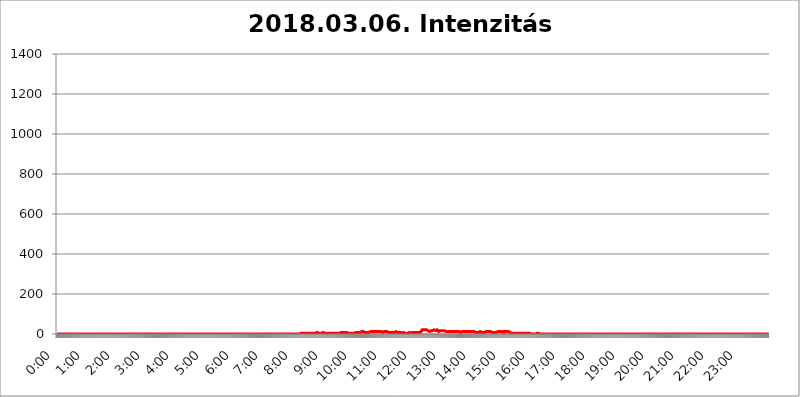
| Category | 2018.03.06. Intenzitás [W/m^2] |
|---|---|
| 0.0 | 0 |
| 0.0006944444444444445 | 0 |
| 0.001388888888888889 | 0 |
| 0.0020833333333333333 | 0 |
| 0.002777777777777778 | 0 |
| 0.003472222222222222 | 0 |
| 0.004166666666666667 | 0 |
| 0.004861111111111111 | 0 |
| 0.005555555555555556 | 0 |
| 0.0062499999999999995 | 0 |
| 0.006944444444444444 | 0 |
| 0.007638888888888889 | 0 |
| 0.008333333333333333 | 0 |
| 0.009027777777777779 | 0 |
| 0.009722222222222222 | 0 |
| 0.010416666666666666 | 0 |
| 0.011111111111111112 | 0 |
| 0.011805555555555555 | 0 |
| 0.012499999999999999 | 0 |
| 0.013194444444444444 | 0 |
| 0.013888888888888888 | 0 |
| 0.014583333333333332 | 0 |
| 0.015277777777777777 | 0 |
| 0.015972222222222224 | 0 |
| 0.016666666666666666 | 0 |
| 0.017361111111111112 | 0 |
| 0.018055555555555557 | 0 |
| 0.01875 | 0 |
| 0.019444444444444445 | 0 |
| 0.02013888888888889 | 0 |
| 0.020833333333333332 | 0 |
| 0.02152777777777778 | 0 |
| 0.022222222222222223 | 0 |
| 0.02291666666666667 | 0 |
| 0.02361111111111111 | 0 |
| 0.024305555555555556 | 0 |
| 0.024999999999999998 | 0 |
| 0.025694444444444447 | 0 |
| 0.02638888888888889 | 0 |
| 0.027083333333333334 | 0 |
| 0.027777777777777776 | 0 |
| 0.02847222222222222 | 0 |
| 0.029166666666666664 | 0 |
| 0.029861111111111113 | 0 |
| 0.030555555555555555 | 0 |
| 0.03125 | 0 |
| 0.03194444444444445 | 0 |
| 0.03263888888888889 | 0 |
| 0.03333333333333333 | 0 |
| 0.034027777777777775 | 0 |
| 0.034722222222222224 | 0 |
| 0.035416666666666666 | 0 |
| 0.036111111111111115 | 0 |
| 0.03680555555555556 | 0 |
| 0.0375 | 0 |
| 0.03819444444444444 | 0 |
| 0.03888888888888889 | 0 |
| 0.03958333333333333 | 0 |
| 0.04027777777777778 | 0 |
| 0.04097222222222222 | 0 |
| 0.041666666666666664 | 0 |
| 0.042361111111111106 | 0 |
| 0.04305555555555556 | 0 |
| 0.043750000000000004 | 0 |
| 0.044444444444444446 | 0 |
| 0.04513888888888889 | 0 |
| 0.04583333333333334 | 0 |
| 0.04652777777777778 | 0 |
| 0.04722222222222222 | 0 |
| 0.04791666666666666 | 0 |
| 0.04861111111111111 | 0 |
| 0.049305555555555554 | 0 |
| 0.049999999999999996 | 0 |
| 0.05069444444444445 | 0 |
| 0.051388888888888894 | 0 |
| 0.052083333333333336 | 0 |
| 0.05277777777777778 | 0 |
| 0.05347222222222222 | 0 |
| 0.05416666666666667 | 0 |
| 0.05486111111111111 | 0 |
| 0.05555555555555555 | 0 |
| 0.05625 | 0 |
| 0.05694444444444444 | 0 |
| 0.057638888888888885 | 0 |
| 0.05833333333333333 | 0 |
| 0.05902777777777778 | 0 |
| 0.059722222222222225 | 0 |
| 0.06041666666666667 | 0 |
| 0.061111111111111116 | 0 |
| 0.06180555555555556 | 0 |
| 0.0625 | 0 |
| 0.06319444444444444 | 0 |
| 0.06388888888888888 | 0 |
| 0.06458333333333334 | 0 |
| 0.06527777777777778 | 0 |
| 0.06597222222222222 | 0 |
| 0.06666666666666667 | 0 |
| 0.06736111111111111 | 0 |
| 0.06805555555555555 | 0 |
| 0.06874999999999999 | 0 |
| 0.06944444444444443 | 0 |
| 0.07013888888888889 | 0 |
| 0.07083333333333333 | 0 |
| 0.07152777777777779 | 0 |
| 0.07222222222222223 | 0 |
| 0.07291666666666667 | 0 |
| 0.07361111111111111 | 0 |
| 0.07430555555555556 | 0 |
| 0.075 | 0 |
| 0.07569444444444444 | 0 |
| 0.0763888888888889 | 0 |
| 0.07708333333333334 | 0 |
| 0.07777777777777778 | 0 |
| 0.07847222222222222 | 0 |
| 0.07916666666666666 | 0 |
| 0.0798611111111111 | 0 |
| 0.08055555555555556 | 0 |
| 0.08125 | 0 |
| 0.08194444444444444 | 0 |
| 0.08263888888888889 | 0 |
| 0.08333333333333333 | 0 |
| 0.08402777777777777 | 0 |
| 0.08472222222222221 | 0 |
| 0.08541666666666665 | 0 |
| 0.08611111111111112 | 0 |
| 0.08680555555555557 | 0 |
| 0.08750000000000001 | 0 |
| 0.08819444444444445 | 0 |
| 0.08888888888888889 | 0 |
| 0.08958333333333333 | 0 |
| 0.09027777777777778 | 0 |
| 0.09097222222222222 | 0 |
| 0.09166666666666667 | 0 |
| 0.09236111111111112 | 0 |
| 0.09305555555555556 | 0 |
| 0.09375 | 0 |
| 0.09444444444444444 | 0 |
| 0.09513888888888888 | 0 |
| 0.09583333333333333 | 0 |
| 0.09652777777777777 | 0 |
| 0.09722222222222222 | 0 |
| 0.09791666666666667 | 0 |
| 0.09861111111111111 | 0 |
| 0.09930555555555555 | 0 |
| 0.09999999999999999 | 0 |
| 0.10069444444444443 | 0 |
| 0.1013888888888889 | 0 |
| 0.10208333333333335 | 0 |
| 0.10277777777777779 | 0 |
| 0.10347222222222223 | 0 |
| 0.10416666666666667 | 0 |
| 0.10486111111111111 | 0 |
| 0.10555555555555556 | 0 |
| 0.10625 | 0 |
| 0.10694444444444444 | 0 |
| 0.1076388888888889 | 0 |
| 0.10833333333333334 | 0 |
| 0.10902777777777778 | 0 |
| 0.10972222222222222 | 0 |
| 0.1111111111111111 | 0 |
| 0.11180555555555556 | 0 |
| 0.11180555555555556 | 0 |
| 0.1125 | 0 |
| 0.11319444444444444 | 0 |
| 0.11388888888888889 | 0 |
| 0.11458333333333333 | 0 |
| 0.11527777777777777 | 0 |
| 0.11597222222222221 | 0 |
| 0.11666666666666665 | 0 |
| 0.1173611111111111 | 0 |
| 0.11805555555555557 | 0 |
| 0.11944444444444445 | 0 |
| 0.12013888888888889 | 0 |
| 0.12083333333333333 | 0 |
| 0.12152777777777778 | 0 |
| 0.12222222222222223 | 0 |
| 0.12291666666666667 | 0 |
| 0.12291666666666667 | 0 |
| 0.12361111111111112 | 0 |
| 0.12430555555555556 | 0 |
| 0.125 | 0 |
| 0.12569444444444444 | 0 |
| 0.12638888888888888 | 0 |
| 0.12708333333333333 | 0 |
| 0.16875 | 0 |
| 0.12847222222222224 | 0 |
| 0.12916666666666668 | 0 |
| 0.12986111111111112 | 0 |
| 0.13055555555555556 | 0 |
| 0.13125 | 0 |
| 0.13194444444444445 | 0 |
| 0.1326388888888889 | 0 |
| 0.13333333333333333 | 0 |
| 0.13402777777777777 | 0 |
| 0.13402777777777777 | 0 |
| 0.13472222222222222 | 0 |
| 0.13541666666666666 | 0 |
| 0.1361111111111111 | 0 |
| 0.13749999999999998 | 0 |
| 0.13819444444444443 | 0 |
| 0.1388888888888889 | 0 |
| 0.13958333333333334 | 0 |
| 0.14027777777777778 | 0 |
| 0.14097222222222222 | 0 |
| 0.14166666666666666 | 0 |
| 0.1423611111111111 | 0 |
| 0.14305555555555557 | 0 |
| 0.14375000000000002 | 0 |
| 0.14444444444444446 | 0 |
| 0.1451388888888889 | 0 |
| 0.1451388888888889 | 0 |
| 0.14652777777777778 | 0 |
| 0.14722222222222223 | 0 |
| 0.14791666666666667 | 0 |
| 0.1486111111111111 | 0 |
| 0.14930555555555555 | 0 |
| 0.15 | 0 |
| 0.15069444444444444 | 0 |
| 0.15138888888888888 | 0 |
| 0.15208333333333332 | 0 |
| 0.15277777777777776 | 0 |
| 0.15347222222222223 | 0 |
| 0.15416666666666667 | 0 |
| 0.15486111111111112 | 0 |
| 0.15555555555555556 | 0 |
| 0.15625 | 0 |
| 0.15694444444444444 | 0 |
| 0.15763888888888888 | 0 |
| 0.15833333333333333 | 0 |
| 0.15902777777777777 | 0 |
| 0.15972222222222224 | 0 |
| 0.16041666666666668 | 0 |
| 0.16111111111111112 | 0 |
| 0.16180555555555556 | 0 |
| 0.1625 | 0 |
| 0.16319444444444445 | 0 |
| 0.1638888888888889 | 0 |
| 0.16458333333333333 | 0 |
| 0.16527777777777777 | 0 |
| 0.16597222222222222 | 0 |
| 0.16666666666666666 | 0 |
| 0.1673611111111111 | 0 |
| 0.16805555555555554 | 0 |
| 0.16874999999999998 | 0 |
| 0.16944444444444443 | 0 |
| 0.17013888888888887 | 0 |
| 0.1708333333333333 | 0 |
| 0.17152777777777775 | 0 |
| 0.17222222222222225 | 0 |
| 0.1729166666666667 | 0 |
| 0.17361111111111113 | 0 |
| 0.17430555555555557 | 0 |
| 0.17500000000000002 | 0 |
| 0.17569444444444446 | 0 |
| 0.1763888888888889 | 0 |
| 0.17708333333333334 | 0 |
| 0.17777777777777778 | 0 |
| 0.17847222222222223 | 0 |
| 0.17916666666666667 | 0 |
| 0.1798611111111111 | 0 |
| 0.18055555555555555 | 0 |
| 0.18125 | 0 |
| 0.18194444444444444 | 0 |
| 0.1826388888888889 | 0 |
| 0.18333333333333335 | 0 |
| 0.1840277777777778 | 0 |
| 0.18472222222222223 | 0 |
| 0.18541666666666667 | 0 |
| 0.18611111111111112 | 0 |
| 0.18680555555555556 | 0 |
| 0.1875 | 0 |
| 0.18819444444444444 | 0 |
| 0.18888888888888888 | 0 |
| 0.18958333333333333 | 0 |
| 0.19027777777777777 | 0 |
| 0.1909722222222222 | 0 |
| 0.19166666666666665 | 0 |
| 0.19236111111111112 | 0 |
| 0.19305555555555554 | 0 |
| 0.19375 | 0 |
| 0.19444444444444445 | 0 |
| 0.1951388888888889 | 0 |
| 0.19583333333333333 | 0 |
| 0.19652777777777777 | 0 |
| 0.19722222222222222 | 0 |
| 0.19791666666666666 | 0 |
| 0.1986111111111111 | 0 |
| 0.19930555555555554 | 0 |
| 0.19999999999999998 | 0 |
| 0.20069444444444443 | 0 |
| 0.20138888888888887 | 0 |
| 0.2020833333333333 | 0 |
| 0.2027777777777778 | 0 |
| 0.2034722222222222 | 0 |
| 0.2041666666666667 | 0 |
| 0.20486111111111113 | 0 |
| 0.20555555555555557 | 0 |
| 0.20625000000000002 | 0 |
| 0.20694444444444446 | 0 |
| 0.2076388888888889 | 0 |
| 0.20833333333333334 | 0 |
| 0.20902777777777778 | 0 |
| 0.20972222222222223 | 0 |
| 0.21041666666666667 | 0 |
| 0.2111111111111111 | 0 |
| 0.21180555555555555 | 0 |
| 0.2125 | 0 |
| 0.21319444444444444 | 0 |
| 0.2138888888888889 | 0 |
| 0.21458333333333335 | 0 |
| 0.2152777777777778 | 0 |
| 0.21597222222222223 | 0 |
| 0.21666666666666667 | 0 |
| 0.21736111111111112 | 0 |
| 0.21805555555555556 | 0 |
| 0.21875 | 0 |
| 0.21944444444444444 | 0 |
| 0.22013888888888888 | 0 |
| 0.22083333333333333 | 0 |
| 0.22152777777777777 | 0 |
| 0.2222222222222222 | 0 |
| 0.22291666666666665 | 0 |
| 0.2236111111111111 | 0 |
| 0.22430555555555556 | 0 |
| 0.225 | 0 |
| 0.22569444444444445 | 0 |
| 0.2263888888888889 | 0 |
| 0.22708333333333333 | 0 |
| 0.22777777777777777 | 0 |
| 0.22847222222222222 | 0 |
| 0.22916666666666666 | 0 |
| 0.2298611111111111 | 0 |
| 0.23055555555555554 | 0 |
| 0.23124999999999998 | 0 |
| 0.23194444444444443 | 0 |
| 0.23263888888888887 | 0 |
| 0.2333333333333333 | 0 |
| 0.2340277777777778 | 0 |
| 0.2347222222222222 | 0 |
| 0.2354166666666667 | 0 |
| 0.23611111111111113 | 0 |
| 0.23680555555555557 | 0 |
| 0.23750000000000002 | 0 |
| 0.23819444444444446 | 0 |
| 0.2388888888888889 | 0 |
| 0.23958333333333334 | 0 |
| 0.24027777777777778 | 0 |
| 0.24097222222222223 | 0 |
| 0.24166666666666667 | 0 |
| 0.2423611111111111 | 0 |
| 0.24305555555555555 | 0 |
| 0.24375 | 0 |
| 0.24444444444444446 | 0 |
| 0.24513888888888888 | 0 |
| 0.24583333333333335 | 0 |
| 0.2465277777777778 | 0 |
| 0.24722222222222223 | 0 |
| 0.24791666666666667 | 0 |
| 0.24861111111111112 | 0 |
| 0.24930555555555556 | 0 |
| 0.25 | 0 |
| 0.25069444444444444 | 0 |
| 0.2513888888888889 | 0 |
| 0.2520833333333333 | 0 |
| 0.25277777777777777 | 0 |
| 0.2534722222222222 | 0 |
| 0.25416666666666665 | 0 |
| 0.2548611111111111 | 0 |
| 0.2555555555555556 | 0 |
| 0.25625000000000003 | 0 |
| 0.2569444444444445 | 0 |
| 0.2576388888888889 | 0 |
| 0.25833333333333336 | 0 |
| 0.2590277777777778 | 0 |
| 0.25972222222222224 | 0 |
| 0.2604166666666667 | 0 |
| 0.2611111111111111 | 0 |
| 0.26180555555555557 | 0 |
| 0.2625 | 0 |
| 0.26319444444444445 | 0 |
| 0.2638888888888889 | 0 |
| 0.26458333333333334 | 0 |
| 0.2652777777777778 | 0 |
| 0.2659722222222222 | 0 |
| 0.26666666666666666 | 0 |
| 0.2673611111111111 | 0 |
| 0.26805555555555555 | 0 |
| 0.26875 | 0 |
| 0.26944444444444443 | 0 |
| 0.2701388888888889 | 0 |
| 0.2708333333333333 | 0 |
| 0.27152777777777776 | 0 |
| 0.2722222222222222 | 0 |
| 0.27291666666666664 | 0 |
| 0.2736111111111111 | 0 |
| 0.2743055555555555 | 0 |
| 0.27499999999999997 | 0 |
| 0.27569444444444446 | 0 |
| 0.27638888888888885 | 0 |
| 0.27708333333333335 | 0 |
| 0.2777777777777778 | 0 |
| 0.27847222222222223 | 0 |
| 0.2791666666666667 | 0 |
| 0.2798611111111111 | 0 |
| 0.28055555555555556 | 0 |
| 0.28125 | 0 |
| 0.28194444444444444 | 0 |
| 0.2826388888888889 | 0 |
| 0.2833333333333333 | 0 |
| 0.28402777777777777 | 0 |
| 0.2847222222222222 | 0 |
| 0.28541666666666665 | 0 |
| 0.28611111111111115 | 0 |
| 0.28680555555555554 | 0 |
| 0.28750000000000003 | 0 |
| 0.2881944444444445 | 0 |
| 0.2888888888888889 | 0 |
| 0.28958333333333336 | 0 |
| 0.2902777777777778 | 0 |
| 0.29097222222222224 | 0 |
| 0.2916666666666667 | 0 |
| 0.2923611111111111 | 0 |
| 0.29305555555555557 | 0 |
| 0.29375 | 0 |
| 0.29444444444444445 | 0 |
| 0.2951388888888889 | 0 |
| 0.29583333333333334 | 0 |
| 0.2965277777777778 | 0 |
| 0.2972222222222222 | 0 |
| 0.29791666666666666 | 0 |
| 0.2986111111111111 | 0 |
| 0.29930555555555555 | 0 |
| 0.3 | 0 |
| 0.30069444444444443 | 0 |
| 0.3013888888888889 | 0 |
| 0.3020833333333333 | 0 |
| 0.30277777777777776 | 0 |
| 0.3034722222222222 | 0 |
| 0.30416666666666664 | 0 |
| 0.3048611111111111 | 0 |
| 0.3055555555555555 | 0 |
| 0.30624999999999997 | 0 |
| 0.3069444444444444 | 0 |
| 0.3076388888888889 | 0 |
| 0.30833333333333335 | 0 |
| 0.3090277777777778 | 0 |
| 0.30972222222222223 | 0 |
| 0.3104166666666667 | 0 |
| 0.3111111111111111 | 0 |
| 0.31180555555555556 | 0 |
| 0.3125 | 0 |
| 0.31319444444444444 | 0 |
| 0.3138888888888889 | 0 |
| 0.3145833333333333 | 0 |
| 0.31527777777777777 | 0 |
| 0.3159722222222222 | 0 |
| 0.31666666666666665 | 0 |
| 0.31736111111111115 | 0 |
| 0.31805555555555554 | 0 |
| 0.31875000000000003 | 0 |
| 0.3194444444444445 | 0 |
| 0.3201388888888889 | 0 |
| 0.32083333333333336 | 0 |
| 0.3215277777777778 | 0 |
| 0.32222222222222224 | 0 |
| 0.3229166666666667 | 0 |
| 0.3236111111111111 | 0 |
| 0.32430555555555557 | 0 |
| 0.325 | 0 |
| 0.32569444444444445 | 0 |
| 0.3263888888888889 | 0 |
| 0.32708333333333334 | 0 |
| 0.3277777777777778 | 0 |
| 0.3284722222222222 | 0 |
| 0.32916666666666666 | 0 |
| 0.3298611111111111 | 0 |
| 0.33055555555555555 | 0 |
| 0.33125 | 0 |
| 0.33194444444444443 | 0 |
| 0.3326388888888889 | 0 |
| 0.3333333333333333 | 0 |
| 0.3340277777777778 | 0 |
| 0.3347222222222222 | 0 |
| 0.3354166666666667 | 0 |
| 0.3361111111111111 | 0 |
| 0.3368055555555556 | 0 |
| 0.33749999999999997 | 0 |
| 0.33819444444444446 | 0 |
| 0.33888888888888885 | 0 |
| 0.33958333333333335 | 0 |
| 0.34027777777777773 | 0 |
| 0.34097222222222223 | 0 |
| 0.3416666666666666 | 3.525 |
| 0.3423611111111111 | 3.525 |
| 0.3430555555555555 | 3.525 |
| 0.34375 | 3.525 |
| 0.3444444444444445 | 3.525 |
| 0.3451388888888889 | 3.525 |
| 0.3458333333333334 | 3.525 |
| 0.34652777777777777 | 3.525 |
| 0.34722222222222227 | 3.525 |
| 0.34791666666666665 | 3.525 |
| 0.34861111111111115 | 3.525 |
| 0.34930555555555554 | 3.525 |
| 0.35000000000000003 | 3.525 |
| 0.3506944444444444 | 3.525 |
| 0.3513888888888889 | 3.525 |
| 0.3520833333333333 | 3.525 |
| 0.3527777777777778 | 3.525 |
| 0.3534722222222222 | 3.525 |
| 0.3541666666666667 | 3.525 |
| 0.3548611111111111 | 3.525 |
| 0.35555555555555557 | 3.525 |
| 0.35625 | 3.525 |
| 0.35694444444444445 | 3.525 |
| 0.3576388888888889 | 3.525 |
| 0.35833333333333334 | 3.525 |
| 0.3590277777777778 | 3.525 |
| 0.3597222222222222 | 3.525 |
| 0.36041666666666666 | 3.525 |
| 0.3611111111111111 | 3.525 |
| 0.36180555555555555 | 3.525 |
| 0.3625 | 3.525 |
| 0.36319444444444443 | 3.525 |
| 0.3638888888888889 | 3.525 |
| 0.3645833333333333 | 7.887 |
| 0.3652777777777778 | 7.887 |
| 0.3659722222222222 | 7.887 |
| 0.3666666666666667 | 3.525 |
| 0.3673611111111111 | 3.525 |
| 0.3680555555555556 | 3.525 |
| 0.36874999999999997 | 3.525 |
| 0.36944444444444446 | 3.525 |
| 0.37013888888888885 | 3.525 |
| 0.37083333333333335 | 3.525 |
| 0.37152777777777773 | 7.887 |
| 0.37222222222222223 | 3.525 |
| 0.3729166666666666 | 7.887 |
| 0.3736111111111111 | 3.525 |
| 0.3743055555555555 | 3.525 |
| 0.375 | 3.525 |
| 0.3756944444444445 | 3.525 |
| 0.3763888888888889 | 3.525 |
| 0.3770833333333334 | 3.525 |
| 0.37777777777777777 | 3.525 |
| 0.37847222222222227 | 3.525 |
| 0.37916666666666665 | 3.525 |
| 0.37986111111111115 | 3.525 |
| 0.38055555555555554 | 3.525 |
| 0.38125000000000003 | 3.525 |
| 0.3819444444444444 | 3.525 |
| 0.3826388888888889 | 3.525 |
| 0.3833333333333333 | 3.525 |
| 0.3840277777777778 | 3.525 |
| 0.3847222222222222 | 3.525 |
| 0.3854166666666667 | 3.525 |
| 0.3861111111111111 | 7.887 |
| 0.38680555555555557 | 7.887 |
| 0.3875 | 3.525 |
| 0.38819444444444445 | 3.525 |
| 0.3888888888888889 | 3.525 |
| 0.38958333333333334 | 3.525 |
| 0.3902777777777778 | 3.525 |
| 0.3909722222222222 | 3.525 |
| 0.39166666666666666 | 3.525 |
| 0.3923611111111111 | 3.525 |
| 0.39305555555555555 | 3.525 |
| 0.39375 | 3.525 |
| 0.39444444444444443 | 3.525 |
| 0.3951388888888889 | 3.525 |
| 0.3958333333333333 | 3.525 |
| 0.3965277777777778 | 3.525 |
| 0.3972222222222222 | 7.887 |
| 0.3979166666666667 | 7.887 |
| 0.3986111111111111 | 7.887 |
| 0.3993055555555556 | 7.887 |
| 0.39999999999999997 | 7.887 |
| 0.40069444444444446 | 7.887 |
| 0.40138888888888885 | 7.887 |
| 0.40208333333333335 | 7.887 |
| 0.40277777777777773 | 7.887 |
| 0.40347222222222223 | 7.887 |
| 0.4041666666666666 | 7.887 |
| 0.4048611111111111 | 7.887 |
| 0.4055555555555555 | 7.887 |
| 0.40625 | 7.887 |
| 0.4069444444444445 | 7.887 |
| 0.4076388888888889 | 3.525 |
| 0.4083333333333334 | 3.525 |
| 0.40902777777777777 | 3.525 |
| 0.40972222222222227 | 3.525 |
| 0.41041666666666665 | 3.525 |
| 0.41111111111111115 | 3.525 |
| 0.41180555555555554 | 3.525 |
| 0.41250000000000003 | 3.525 |
| 0.4131944444444444 | 3.525 |
| 0.4138888888888889 | 3.525 |
| 0.4145833333333333 | 3.525 |
| 0.4152777777777778 | 3.525 |
| 0.4159722222222222 | 3.525 |
| 0.4166666666666667 | 3.525 |
| 0.4173611111111111 | 7.887 |
| 0.41805555555555557 | 7.887 |
| 0.41875 | 7.887 |
| 0.41944444444444445 | 7.887 |
| 0.4201388888888889 | 7.887 |
| 0.42083333333333334 | 7.887 |
| 0.4215277777777778 | 12.257 |
| 0.4222222222222222 | 12.257 |
| 0.42291666666666666 | 7.887 |
| 0.4236111111111111 | 7.887 |
| 0.42430555555555555 | 7.887 |
| 0.425 | 7.887 |
| 0.42569444444444443 | 7.887 |
| 0.4263888888888889 | 12.257 |
| 0.4270833333333333 | 12.257 |
| 0.4277777777777778 | 12.257 |
| 0.4284722222222222 | 12.257 |
| 0.4291666666666667 | 12.257 |
| 0.4298611111111111 | 12.257 |
| 0.4305555555555556 | 12.257 |
| 0.43124999999999997 | 7.887 |
| 0.43194444444444446 | 7.887 |
| 0.43263888888888885 | 7.887 |
| 0.43333333333333335 | 7.887 |
| 0.43402777777777773 | 7.887 |
| 0.43472222222222223 | 7.887 |
| 0.4354166666666666 | 7.887 |
| 0.4361111111111111 | 7.887 |
| 0.4368055555555555 | 7.887 |
| 0.4375 | 7.887 |
| 0.4381944444444445 | 7.887 |
| 0.4388888888888889 | 7.887 |
| 0.4395833333333334 | 12.257 |
| 0.44027777777777777 | 12.257 |
| 0.44097222222222227 | 12.257 |
| 0.44166666666666665 | 12.257 |
| 0.44236111111111115 | 12.257 |
| 0.44305555555555554 | 12.257 |
| 0.44375000000000003 | 12.257 |
| 0.4444444444444444 | 12.257 |
| 0.4451388888888889 | 12.257 |
| 0.4458333333333333 | 12.257 |
| 0.4465277777777778 | 12.257 |
| 0.4472222222222222 | 12.257 |
| 0.4479166666666667 | 12.257 |
| 0.4486111111111111 | 12.257 |
| 0.44930555555555557 | 12.257 |
| 0.45 | 12.257 |
| 0.45069444444444445 | 12.257 |
| 0.4513888888888889 | 12.257 |
| 0.45208333333333334 | 12.257 |
| 0.4527777777777778 | 12.257 |
| 0.4534722222222222 | 12.257 |
| 0.45416666666666666 | 12.257 |
| 0.4548611111111111 | 12.257 |
| 0.45555555555555555 | 7.887 |
| 0.45625 | 7.887 |
| 0.45694444444444443 | 12.257 |
| 0.4576388888888889 | 12.257 |
| 0.4583333333333333 | 12.257 |
| 0.4590277777777778 | 12.257 |
| 0.4597222222222222 | 12.257 |
| 0.4604166666666667 | 12.257 |
| 0.4611111111111111 | 12.257 |
| 0.4618055555555556 | 12.257 |
| 0.46249999999999997 | 12.257 |
| 0.46319444444444446 | 7.887 |
| 0.46388888888888885 | 7.887 |
| 0.46458333333333335 | 7.887 |
| 0.46527777777777773 | 7.887 |
| 0.46597222222222223 | 7.887 |
| 0.4666666666666666 | 7.887 |
| 0.4673611111111111 | 7.887 |
| 0.4680555555555555 | 7.887 |
| 0.46875 | 7.887 |
| 0.4694444444444445 | 12.257 |
| 0.4701388888888889 | 7.887 |
| 0.4708333333333334 | 7.887 |
| 0.47152777777777777 | 7.887 |
| 0.47222222222222227 | 7.887 |
| 0.47291666666666665 | 7.887 |
| 0.47361111111111115 | 12.257 |
| 0.47430555555555554 | 12.257 |
| 0.47500000000000003 | 12.257 |
| 0.4756944444444444 | 7.887 |
| 0.4763888888888889 | 7.887 |
| 0.4770833333333333 | 7.887 |
| 0.4777777777777778 | 7.887 |
| 0.4784722222222222 | 7.887 |
| 0.4791666666666667 | 7.887 |
| 0.4798611111111111 | 7.887 |
| 0.48055555555555557 | 7.887 |
| 0.48125 | 7.887 |
| 0.48194444444444445 | 3.525 |
| 0.4826388888888889 | 3.525 |
| 0.48333333333333334 | 3.525 |
| 0.4840277777777778 | 7.887 |
| 0.4847222222222222 | 7.887 |
| 0.48541666666666666 | 7.887 |
| 0.4861111111111111 | 7.887 |
| 0.48680555555555555 | 3.525 |
| 0.4875 | 3.525 |
| 0.48819444444444443 | 3.525 |
| 0.4888888888888889 | 3.525 |
| 0.4895833333333333 | 3.525 |
| 0.4902777777777778 | 3.525 |
| 0.4909722222222222 | 3.525 |
| 0.4916666666666667 | 3.525 |
| 0.4923611111111111 | 3.525 |
| 0.4930555555555556 | 7.887 |
| 0.49374999999999997 | 7.887 |
| 0.49444444444444446 | 3.525 |
| 0.49513888888888885 | 3.525 |
| 0.49583333333333335 | 3.525 |
| 0.49652777777777773 | 7.887 |
| 0.49722222222222223 | 7.887 |
| 0.4979166666666666 | 7.887 |
| 0.4986111111111111 | 7.887 |
| 0.4993055555555555 | 7.887 |
| 0.5 | 7.887 |
| 0.5006944444444444 | 7.887 |
| 0.5013888888888889 | 7.887 |
| 0.5020833333333333 | 7.887 |
| 0.5027777777777778 | 12.257 |
| 0.5034722222222222 | 12.257 |
| 0.5041666666666667 | 7.887 |
| 0.5048611111111111 | 7.887 |
| 0.5055555555555555 | 7.887 |
| 0.50625 | 7.887 |
| 0.5069444444444444 | 7.887 |
| 0.5076388888888889 | 7.887 |
| 0.5083333333333333 | 7.887 |
| 0.5090277777777777 | 7.887 |
| 0.5097222222222222 | 12.257 |
| 0.5104166666666666 | 12.257 |
| 0.5111111111111112 | 16.636 |
| 0.5118055555555555 | 21.024 |
| 0.5125000000000001 | 25.419 |
| 0.5131944444444444 | 21.024 |
| 0.513888888888889 | 21.024 |
| 0.5145833333333333 | 16.636 |
| 0.5152777777777778 | 21.024 |
| 0.5159722222222222 | 21.024 |
| 0.5166666666666667 | 21.024 |
| 0.517361111111111 | 21.024 |
| 0.5180555555555556 | 21.024 |
| 0.5187499999999999 | 21.024 |
| 0.5194444444444445 | 21.024 |
| 0.5201388888888888 | 16.636 |
| 0.5208333333333334 | 16.636 |
| 0.5215277777777778 | 12.257 |
| 0.5222222222222223 | 12.257 |
| 0.5229166666666667 | 12.257 |
| 0.5236111111111111 | 12.257 |
| 0.5243055555555556 | 16.636 |
| 0.525 | 16.636 |
| 0.5256944444444445 | 16.636 |
| 0.5263888888888889 | 16.636 |
| 0.5270833333333333 | 16.636 |
| 0.5277777777777778 | 16.636 |
| 0.5284722222222222 | 21.024 |
| 0.5291666666666667 | 21.024 |
| 0.5298611111111111 | 21.024 |
| 0.5305555555555556 | 16.636 |
| 0.53125 | 16.636 |
| 0.5319444444444444 | 16.636 |
| 0.5326388888888889 | 21.024 |
| 0.5333333333333333 | 16.636 |
| 0.5340277777777778 | 16.636 |
| 0.5347222222222222 | 12.257 |
| 0.5354166666666667 | 12.257 |
| 0.5361111111111111 | 12.257 |
| 0.5368055555555555 | 16.636 |
| 0.5375 | 16.636 |
| 0.5381944444444444 | 16.636 |
| 0.5388888888888889 | 16.636 |
| 0.5395833333333333 | 12.257 |
| 0.5402777777777777 | 16.636 |
| 0.5409722222222222 | 16.636 |
| 0.5416666666666666 | 16.636 |
| 0.5423611111111112 | 16.636 |
| 0.5430555555555555 | 16.636 |
| 0.5437500000000001 | 12.257 |
| 0.5444444444444444 | 12.257 |
| 0.545138888888889 | 12.257 |
| 0.5458333333333333 | 12.257 |
| 0.5465277777777778 | 12.257 |
| 0.5472222222222222 | 12.257 |
| 0.5479166666666667 | 12.257 |
| 0.548611111111111 | 12.257 |
| 0.5493055555555556 | 12.257 |
| 0.5499999999999999 | 12.257 |
| 0.5506944444444445 | 12.257 |
| 0.5513888888888888 | 12.257 |
| 0.5520833333333334 | 12.257 |
| 0.5527777777777778 | 12.257 |
| 0.5534722222222223 | 12.257 |
| 0.5541666666666667 | 12.257 |
| 0.5548611111111111 | 12.257 |
| 0.5555555555555556 | 12.257 |
| 0.55625 | 12.257 |
| 0.5569444444444445 | 12.257 |
| 0.5576388888888889 | 12.257 |
| 0.5583333333333333 | 12.257 |
| 0.5590277777777778 | 12.257 |
| 0.5597222222222222 | 12.257 |
| 0.5604166666666667 | 12.257 |
| 0.5611111111111111 | 12.257 |
| 0.5618055555555556 | 12.257 |
| 0.5625 | 12.257 |
| 0.5631944444444444 | 12.257 |
| 0.5638888888888889 | 12.257 |
| 0.5645833333333333 | 7.887 |
| 0.5652777777777778 | 7.887 |
| 0.5659722222222222 | 7.887 |
| 0.5666666666666667 | 12.257 |
| 0.5673611111111111 | 12.257 |
| 0.5680555555555555 | 12.257 |
| 0.56875 | 12.257 |
| 0.5694444444444444 | 12.257 |
| 0.5701388888888889 | 12.257 |
| 0.5708333333333333 | 12.257 |
| 0.5715277777777777 | 12.257 |
| 0.5722222222222222 | 12.257 |
| 0.5729166666666666 | 16.636 |
| 0.5736111111111112 | 16.636 |
| 0.5743055555555555 | 12.257 |
| 0.5750000000000001 | 12.257 |
| 0.5756944444444444 | 16.636 |
| 0.576388888888889 | 12.257 |
| 0.5770833333333333 | 12.257 |
| 0.5777777777777778 | 12.257 |
| 0.5784722222222222 | 12.257 |
| 0.5791666666666667 | 7.887 |
| 0.579861111111111 | 12.257 |
| 0.5805555555555556 | 12.257 |
| 0.5812499999999999 | 12.257 |
| 0.5819444444444445 | 7.887 |
| 0.5826388888888888 | 12.257 |
| 0.5833333333333334 | 12.257 |
| 0.5840277777777778 | 7.887 |
| 0.5847222222222223 | 12.257 |
| 0.5854166666666667 | 12.257 |
| 0.5861111111111111 | 7.887 |
| 0.5868055555555556 | 7.887 |
| 0.5875 | 7.887 |
| 0.5881944444444445 | 7.887 |
| 0.5888888888888889 | 7.887 |
| 0.5895833333333333 | 12.257 |
| 0.5902777777777778 | 12.257 |
| 0.5909722222222222 | 7.887 |
| 0.5916666666666667 | 7.887 |
| 0.5923611111111111 | 7.887 |
| 0.5930555555555556 | 12.257 |
| 0.59375 | 12.257 |
| 0.5944444444444444 | 12.257 |
| 0.5951388888888889 | 7.887 |
| 0.5958333333333333 | 7.887 |
| 0.5965277777777778 | 7.887 |
| 0.5972222222222222 | 7.887 |
| 0.5979166666666667 | 7.887 |
| 0.5986111111111111 | 7.887 |
| 0.5993055555555555 | 7.887 |
| 0.6 | 7.887 |
| 0.6006944444444444 | 12.257 |
| 0.6013888888888889 | 12.257 |
| 0.6020833333333333 | 7.887 |
| 0.6027777777777777 | 12.257 |
| 0.6034722222222222 | 12.257 |
| 0.6041666666666666 | 12.257 |
| 0.6048611111111112 | 12.257 |
| 0.6055555555555555 | 12.257 |
| 0.6062500000000001 | 12.257 |
| 0.6069444444444444 | 12.257 |
| 0.607638888888889 | 12.257 |
| 0.6083333333333333 | 7.887 |
| 0.6090277777777778 | 7.887 |
| 0.6097222222222222 | 7.887 |
| 0.6104166666666667 | 7.887 |
| 0.611111111111111 | 7.887 |
| 0.6118055555555556 | 7.887 |
| 0.6124999999999999 | 7.887 |
| 0.6131944444444445 | 7.887 |
| 0.6138888888888888 | 7.887 |
| 0.6145833333333334 | 7.887 |
| 0.6152777777777778 | 7.887 |
| 0.6159722222222223 | 7.887 |
| 0.6166666666666667 | 12.257 |
| 0.6173611111111111 | 12.257 |
| 0.6180555555555556 | 12.257 |
| 0.61875 | 12.257 |
| 0.6194444444444445 | 12.257 |
| 0.6201388888888889 | 12.257 |
| 0.6208333333333333 | 12.257 |
| 0.6215277777777778 | 12.257 |
| 0.6222222222222222 | 12.257 |
| 0.6229166666666667 | 12.257 |
| 0.6236111111111111 | 16.636 |
| 0.6243055555555556 | 12.257 |
| 0.625 | 12.257 |
| 0.6256944444444444 | 12.257 |
| 0.6263888888888889 | 3.525 |
| 0.6270833333333333 | 12.257 |
| 0.6277777777777778 | 12.257 |
| 0.6284722222222222 | 12.257 |
| 0.6291666666666667 | 12.257 |
| 0.6298611111111111 | 12.257 |
| 0.6305555555555555 | 12.257 |
| 0.63125 | 12.257 |
| 0.6319444444444444 | 12.257 |
| 0.6326388888888889 | 12.257 |
| 0.6333333333333333 | 12.257 |
| 0.6340277777777777 | 12.257 |
| 0.6347222222222222 | 7.887 |
| 0.6354166666666666 | 7.887 |
| 0.6361111111111112 | 7.887 |
| 0.6368055555555555 | 7.887 |
| 0.6375000000000001 | 3.525 |
| 0.6381944444444444 | 3.525 |
| 0.638888888888889 | 3.525 |
| 0.6395833333333333 | 3.525 |
| 0.6402777777777778 | 3.525 |
| 0.6409722222222222 | 3.525 |
| 0.6416666666666667 | 3.525 |
| 0.642361111111111 | 3.525 |
| 0.6430555555555556 | 3.525 |
| 0.6437499999999999 | 3.525 |
| 0.6444444444444445 | 3.525 |
| 0.6451388888888888 | 3.525 |
| 0.6458333333333334 | 3.525 |
| 0.6465277777777778 | 3.525 |
| 0.6472222222222223 | 3.525 |
| 0.6479166666666667 | 3.525 |
| 0.6486111111111111 | 3.525 |
| 0.6493055555555556 | 3.525 |
| 0.65 | 3.525 |
| 0.6506944444444445 | 3.525 |
| 0.6513888888888889 | 3.525 |
| 0.6520833333333333 | 3.525 |
| 0.6527777777777778 | 3.525 |
| 0.6534722222222222 | 3.525 |
| 0.6541666666666667 | 3.525 |
| 0.6548611111111111 | 3.525 |
| 0.6555555555555556 | 3.525 |
| 0.65625 | 3.525 |
| 0.6569444444444444 | 3.525 |
| 0.6576388888888889 | 3.525 |
| 0.6583333333333333 | 3.525 |
| 0.6590277777777778 | 3.525 |
| 0.6597222222222222 | 3.525 |
| 0.6604166666666667 | 3.525 |
| 0.6611111111111111 | 3.525 |
| 0.6618055555555555 | 3.525 |
| 0.6625 | 3.525 |
| 0.6631944444444444 | 3.525 |
| 0.6638888888888889 | 0 |
| 0.6645833333333333 | 0 |
| 0.6652777777777777 | 0 |
| 0.6659722222222222 | 0 |
| 0.6666666666666666 | 0 |
| 0.6673611111111111 | 0 |
| 0.6680555555555556 | 0 |
| 0.6687500000000001 | 0 |
| 0.6694444444444444 | 0 |
| 0.6701388888888888 | 0 |
| 0.6708333333333334 | 0 |
| 0.6715277777777778 | 0 |
| 0.6722222222222222 | 0 |
| 0.6729166666666666 | 3.525 |
| 0.6736111111111112 | 3.525 |
| 0.6743055555555556 | 3.525 |
| 0.6749999999999999 | 3.525 |
| 0.6756944444444444 | 0 |
| 0.6763888888888889 | 3.525 |
| 0.6770833333333334 | 0 |
| 0.6777777777777777 | 0 |
| 0.6784722222222223 | 0 |
| 0.6791666666666667 | 0 |
| 0.6798611111111111 | 0 |
| 0.6805555555555555 | 0 |
| 0.68125 | 0 |
| 0.6819444444444445 | 0 |
| 0.6826388888888889 | 0 |
| 0.6833333333333332 | 0 |
| 0.6840277777777778 | 0 |
| 0.6847222222222222 | 0 |
| 0.6854166666666667 | 0 |
| 0.686111111111111 | 0 |
| 0.6868055555555556 | 0 |
| 0.6875 | 0 |
| 0.6881944444444444 | 0 |
| 0.688888888888889 | 0 |
| 0.6895833333333333 | 0 |
| 0.6902777777777778 | 0 |
| 0.6909722222222222 | 0 |
| 0.6916666666666668 | 0 |
| 0.6923611111111111 | 0 |
| 0.6930555555555555 | 0 |
| 0.69375 | 0 |
| 0.6944444444444445 | 0 |
| 0.6951388888888889 | 0 |
| 0.6958333333333333 | 0 |
| 0.6965277777777777 | 0 |
| 0.6972222222222223 | 0 |
| 0.6979166666666666 | 0 |
| 0.6986111111111111 | 0 |
| 0.6993055555555556 | 0 |
| 0.7000000000000001 | 0 |
| 0.7006944444444444 | 0 |
| 0.7013888888888888 | 0 |
| 0.7020833333333334 | 0 |
| 0.7027777777777778 | 0 |
| 0.7034722222222222 | 0 |
| 0.7041666666666666 | 0 |
| 0.7048611111111112 | 0 |
| 0.7055555555555556 | 0 |
| 0.7062499999999999 | 0 |
| 0.7069444444444444 | 0 |
| 0.7076388888888889 | 0 |
| 0.7083333333333334 | 0 |
| 0.7090277777777777 | 0 |
| 0.7097222222222223 | 0 |
| 0.7104166666666667 | 0 |
| 0.7111111111111111 | 0 |
| 0.7118055555555555 | 0 |
| 0.7125 | 0 |
| 0.7131944444444445 | 0 |
| 0.7138888888888889 | 0 |
| 0.7145833333333332 | 0 |
| 0.7152777777777778 | 0 |
| 0.7159722222222222 | 0 |
| 0.7166666666666667 | 0 |
| 0.717361111111111 | 0 |
| 0.7180555555555556 | 0 |
| 0.71875 | 0 |
| 0.7194444444444444 | 0 |
| 0.720138888888889 | 0 |
| 0.7208333333333333 | 0 |
| 0.7215277777777778 | 0 |
| 0.7222222222222222 | 0 |
| 0.7229166666666668 | 0 |
| 0.7236111111111111 | 0 |
| 0.7243055555555555 | 0 |
| 0.725 | 0 |
| 0.7256944444444445 | 0 |
| 0.7263888888888889 | 0 |
| 0.7270833333333333 | 0 |
| 0.7277777777777777 | 0 |
| 0.7284722222222223 | 0 |
| 0.7291666666666666 | 0 |
| 0.7298611111111111 | 0 |
| 0.7305555555555556 | 0 |
| 0.7312500000000001 | 0 |
| 0.7319444444444444 | 0 |
| 0.7326388888888888 | 0 |
| 0.7333333333333334 | 0 |
| 0.7340277777777778 | 0 |
| 0.7347222222222222 | 0 |
| 0.7354166666666666 | 0 |
| 0.7361111111111112 | 0 |
| 0.7368055555555556 | 0 |
| 0.7374999999999999 | 0 |
| 0.7381944444444444 | 0 |
| 0.7388888888888889 | 0 |
| 0.7395833333333334 | 0 |
| 0.7402777777777777 | 0 |
| 0.7409722222222223 | 0 |
| 0.7416666666666667 | 0 |
| 0.7423611111111111 | 0 |
| 0.7430555555555555 | 0 |
| 0.74375 | 0 |
| 0.7444444444444445 | 0 |
| 0.7451388888888889 | 0 |
| 0.7458333333333332 | 0 |
| 0.7465277777777778 | 0 |
| 0.7472222222222222 | 0 |
| 0.7479166666666667 | 0 |
| 0.748611111111111 | 0 |
| 0.7493055555555556 | 0 |
| 0.75 | 0 |
| 0.7506944444444444 | 0 |
| 0.751388888888889 | 0 |
| 0.7520833333333333 | 0 |
| 0.7527777777777778 | 0 |
| 0.7534722222222222 | 0 |
| 0.7541666666666668 | 0 |
| 0.7548611111111111 | 0 |
| 0.7555555555555555 | 0 |
| 0.75625 | 0 |
| 0.7569444444444445 | 0 |
| 0.7576388888888889 | 0 |
| 0.7583333333333333 | 0 |
| 0.7590277777777777 | 0 |
| 0.7597222222222223 | 0 |
| 0.7604166666666666 | 0 |
| 0.7611111111111111 | 0 |
| 0.7618055555555556 | 0 |
| 0.7625000000000001 | 0 |
| 0.7631944444444444 | 0 |
| 0.7638888888888888 | 0 |
| 0.7645833333333334 | 0 |
| 0.7652777777777778 | 0 |
| 0.7659722222222222 | 0 |
| 0.7666666666666666 | 0 |
| 0.7673611111111112 | 0 |
| 0.7680555555555556 | 0 |
| 0.7687499999999999 | 0 |
| 0.7694444444444444 | 0 |
| 0.7701388888888889 | 0 |
| 0.7708333333333334 | 0 |
| 0.7715277777777777 | 0 |
| 0.7722222222222223 | 0 |
| 0.7729166666666667 | 0 |
| 0.7736111111111111 | 0 |
| 0.7743055555555555 | 0 |
| 0.775 | 0 |
| 0.7756944444444445 | 0 |
| 0.7763888888888889 | 0 |
| 0.7770833333333332 | 0 |
| 0.7777777777777778 | 0 |
| 0.7784722222222222 | 0 |
| 0.7791666666666667 | 0 |
| 0.779861111111111 | 0 |
| 0.7805555555555556 | 0 |
| 0.78125 | 0 |
| 0.7819444444444444 | 0 |
| 0.782638888888889 | 0 |
| 0.7833333333333333 | 0 |
| 0.7840277777777778 | 0 |
| 0.7847222222222222 | 0 |
| 0.7854166666666668 | 0 |
| 0.7861111111111111 | 0 |
| 0.7868055555555555 | 0 |
| 0.7875 | 0 |
| 0.7881944444444445 | 0 |
| 0.7888888888888889 | 0 |
| 0.7895833333333333 | 0 |
| 0.7902777777777777 | 0 |
| 0.7909722222222223 | 0 |
| 0.7916666666666666 | 0 |
| 0.7923611111111111 | 0 |
| 0.7930555555555556 | 0 |
| 0.7937500000000001 | 0 |
| 0.7944444444444444 | 0 |
| 0.7951388888888888 | 0 |
| 0.7958333333333334 | 0 |
| 0.7965277777777778 | 0 |
| 0.7972222222222222 | 0 |
| 0.7979166666666666 | 0 |
| 0.7986111111111112 | 0 |
| 0.7993055555555556 | 0 |
| 0.7999999999999999 | 0 |
| 0.8006944444444444 | 0 |
| 0.8013888888888889 | 0 |
| 0.8020833333333334 | 0 |
| 0.8027777777777777 | 0 |
| 0.8034722222222223 | 0 |
| 0.8041666666666667 | 0 |
| 0.8048611111111111 | 0 |
| 0.8055555555555555 | 0 |
| 0.80625 | 0 |
| 0.8069444444444445 | 0 |
| 0.8076388888888889 | 0 |
| 0.8083333333333332 | 0 |
| 0.8090277777777778 | 0 |
| 0.8097222222222222 | 0 |
| 0.8104166666666667 | 0 |
| 0.811111111111111 | 0 |
| 0.8118055555555556 | 0 |
| 0.8125 | 0 |
| 0.8131944444444444 | 0 |
| 0.813888888888889 | 0 |
| 0.8145833333333333 | 0 |
| 0.8152777777777778 | 0 |
| 0.8159722222222222 | 0 |
| 0.8166666666666668 | 0 |
| 0.8173611111111111 | 0 |
| 0.8180555555555555 | 0 |
| 0.81875 | 0 |
| 0.8194444444444445 | 0 |
| 0.8201388888888889 | 0 |
| 0.8208333333333333 | 0 |
| 0.8215277777777777 | 0 |
| 0.8222222222222223 | 0 |
| 0.8229166666666666 | 0 |
| 0.8236111111111111 | 0 |
| 0.8243055555555556 | 0 |
| 0.8250000000000001 | 0 |
| 0.8256944444444444 | 0 |
| 0.8263888888888888 | 0 |
| 0.8270833333333334 | 0 |
| 0.8277777777777778 | 0 |
| 0.8284722222222222 | 0 |
| 0.8291666666666666 | 0 |
| 0.8298611111111112 | 0 |
| 0.8305555555555556 | 0 |
| 0.8312499999999999 | 0 |
| 0.8319444444444444 | 0 |
| 0.8326388888888889 | 0 |
| 0.8333333333333334 | 0 |
| 0.8340277777777777 | 0 |
| 0.8347222222222223 | 0 |
| 0.8354166666666667 | 0 |
| 0.8361111111111111 | 0 |
| 0.8368055555555555 | 0 |
| 0.8375 | 0 |
| 0.8381944444444445 | 0 |
| 0.8388888888888889 | 0 |
| 0.8395833333333332 | 0 |
| 0.8402777777777778 | 0 |
| 0.8409722222222222 | 0 |
| 0.8416666666666667 | 0 |
| 0.842361111111111 | 0 |
| 0.8430555555555556 | 0 |
| 0.84375 | 0 |
| 0.8444444444444444 | 0 |
| 0.845138888888889 | 0 |
| 0.8458333333333333 | 0 |
| 0.8465277777777778 | 0 |
| 0.8472222222222222 | 0 |
| 0.8479166666666668 | 0 |
| 0.8486111111111111 | 0 |
| 0.8493055555555555 | 0 |
| 0.85 | 0 |
| 0.8506944444444445 | 0 |
| 0.8513888888888889 | 0 |
| 0.8520833333333333 | 0 |
| 0.8527777777777777 | 0 |
| 0.8534722222222223 | 0 |
| 0.8541666666666666 | 0 |
| 0.8548611111111111 | 0 |
| 0.8555555555555556 | 0 |
| 0.8562500000000001 | 0 |
| 0.8569444444444444 | 0 |
| 0.8576388888888888 | 0 |
| 0.8583333333333334 | 0 |
| 0.8590277777777778 | 0 |
| 0.8597222222222222 | 0 |
| 0.8604166666666666 | 0 |
| 0.8611111111111112 | 0 |
| 0.8618055555555556 | 0 |
| 0.8624999999999999 | 0 |
| 0.8631944444444444 | 0 |
| 0.8638888888888889 | 0 |
| 0.8645833333333334 | 0 |
| 0.8652777777777777 | 0 |
| 0.8659722222222223 | 0 |
| 0.8666666666666667 | 0 |
| 0.8673611111111111 | 0 |
| 0.8680555555555555 | 0 |
| 0.86875 | 0 |
| 0.8694444444444445 | 0 |
| 0.8701388888888889 | 0 |
| 0.8708333333333332 | 0 |
| 0.8715277777777778 | 0 |
| 0.8722222222222222 | 0 |
| 0.8729166666666667 | 0 |
| 0.873611111111111 | 0 |
| 0.8743055555555556 | 0 |
| 0.875 | 0 |
| 0.8756944444444444 | 0 |
| 0.876388888888889 | 0 |
| 0.8770833333333333 | 0 |
| 0.8777777777777778 | 0 |
| 0.8784722222222222 | 0 |
| 0.8791666666666668 | 0 |
| 0.8798611111111111 | 0 |
| 0.8805555555555555 | 0 |
| 0.88125 | 0 |
| 0.8819444444444445 | 0 |
| 0.8826388888888889 | 0 |
| 0.8833333333333333 | 0 |
| 0.8840277777777777 | 0 |
| 0.8847222222222223 | 0 |
| 0.8854166666666666 | 0 |
| 0.8861111111111111 | 0 |
| 0.8868055555555556 | 0 |
| 0.8875000000000001 | 0 |
| 0.8881944444444444 | 0 |
| 0.8888888888888888 | 0 |
| 0.8895833333333334 | 0 |
| 0.8902777777777778 | 0 |
| 0.8909722222222222 | 0 |
| 0.8916666666666666 | 0 |
| 0.8923611111111112 | 0 |
| 0.8930555555555556 | 0 |
| 0.8937499999999999 | 0 |
| 0.8944444444444444 | 0 |
| 0.8951388888888889 | 0 |
| 0.8958333333333334 | 0 |
| 0.8965277777777777 | 0 |
| 0.8972222222222223 | 0 |
| 0.8979166666666667 | 0 |
| 0.8986111111111111 | 0 |
| 0.8993055555555555 | 0 |
| 0.9 | 0 |
| 0.9006944444444445 | 0 |
| 0.9013888888888889 | 0 |
| 0.9020833333333332 | 0 |
| 0.9027777777777778 | 0 |
| 0.9034722222222222 | 0 |
| 0.9041666666666667 | 0 |
| 0.904861111111111 | 0 |
| 0.9055555555555556 | 0 |
| 0.90625 | 0 |
| 0.9069444444444444 | 0 |
| 0.907638888888889 | 0 |
| 0.9083333333333333 | 0 |
| 0.9090277777777778 | 0 |
| 0.9097222222222222 | 0 |
| 0.9104166666666668 | 0 |
| 0.9111111111111111 | 0 |
| 0.9118055555555555 | 0 |
| 0.9125 | 0 |
| 0.9131944444444445 | 0 |
| 0.9138888888888889 | 0 |
| 0.9145833333333333 | 0 |
| 0.9152777777777777 | 0 |
| 0.9159722222222223 | 0 |
| 0.9166666666666666 | 0 |
| 0.9173611111111111 | 0 |
| 0.9180555555555556 | 0 |
| 0.9187500000000001 | 0 |
| 0.9194444444444444 | 0 |
| 0.9201388888888888 | 0 |
| 0.9208333333333334 | 0 |
| 0.9215277777777778 | 0 |
| 0.9222222222222222 | 0 |
| 0.9229166666666666 | 0 |
| 0.9236111111111112 | 0 |
| 0.9243055555555556 | 0 |
| 0.9249999999999999 | 0 |
| 0.9256944444444444 | 0 |
| 0.9263888888888889 | 0 |
| 0.9270833333333334 | 0 |
| 0.9277777777777777 | 0 |
| 0.9284722222222223 | 0 |
| 0.9291666666666667 | 0 |
| 0.9298611111111111 | 0 |
| 0.9305555555555555 | 0 |
| 0.93125 | 0 |
| 0.9319444444444445 | 0 |
| 0.9326388888888889 | 0 |
| 0.9333333333333332 | 0 |
| 0.9340277777777778 | 0 |
| 0.9347222222222222 | 0 |
| 0.9354166666666667 | 0 |
| 0.936111111111111 | 0 |
| 0.9368055555555556 | 0 |
| 0.9375 | 0 |
| 0.9381944444444444 | 0 |
| 0.938888888888889 | 0 |
| 0.9395833333333333 | 0 |
| 0.9402777777777778 | 0 |
| 0.9409722222222222 | 0 |
| 0.9416666666666668 | 0 |
| 0.9423611111111111 | 0 |
| 0.9430555555555555 | 0 |
| 0.94375 | 0 |
| 0.9444444444444445 | 0 |
| 0.9451388888888889 | 0 |
| 0.9458333333333333 | 0 |
| 0.9465277777777777 | 0 |
| 0.9472222222222223 | 0 |
| 0.9479166666666666 | 0 |
| 0.9486111111111111 | 0 |
| 0.9493055555555556 | 0 |
| 0.9500000000000001 | 0 |
| 0.9506944444444444 | 0 |
| 0.9513888888888888 | 0 |
| 0.9520833333333334 | 0 |
| 0.9527777777777778 | 0 |
| 0.9534722222222222 | 0 |
| 0.9541666666666666 | 0 |
| 0.9548611111111112 | 0 |
| 0.9555555555555556 | 0 |
| 0.9562499999999999 | 0 |
| 0.9569444444444444 | 0 |
| 0.9576388888888889 | 0 |
| 0.9583333333333334 | 0 |
| 0.9590277777777777 | 0 |
| 0.9597222222222223 | 0 |
| 0.9604166666666667 | 0 |
| 0.9611111111111111 | 0 |
| 0.9618055555555555 | 0 |
| 0.9625 | 0 |
| 0.9631944444444445 | 0 |
| 0.9638888888888889 | 0 |
| 0.9645833333333332 | 0 |
| 0.9652777777777778 | 0 |
| 0.9659722222222222 | 0 |
| 0.9666666666666667 | 0 |
| 0.967361111111111 | 0 |
| 0.9680555555555556 | 0 |
| 0.96875 | 0 |
| 0.9694444444444444 | 0 |
| 0.970138888888889 | 0 |
| 0.9708333333333333 | 0 |
| 0.9715277777777778 | 0 |
| 0.9722222222222222 | 0 |
| 0.9729166666666668 | 0 |
| 0.9736111111111111 | 0 |
| 0.9743055555555555 | 0 |
| 0.975 | 0 |
| 0.9756944444444445 | 0 |
| 0.9763888888888889 | 0 |
| 0.9770833333333333 | 0 |
| 0.9777777777777777 | 0 |
| 0.9784722222222223 | 0 |
| 0.9791666666666666 | 0 |
| 0.9798611111111111 | 0 |
| 0.9805555555555556 | 0 |
| 0.9812500000000001 | 0 |
| 0.9819444444444444 | 0 |
| 0.9826388888888888 | 0 |
| 0.9833333333333334 | 0 |
| 0.9840277777777778 | 0 |
| 0.9847222222222222 | 0 |
| 0.9854166666666666 | 0 |
| 0.9861111111111112 | 0 |
| 0.9868055555555556 | 0 |
| 0.9874999999999999 | 0 |
| 0.9881944444444444 | 0 |
| 0.9888888888888889 | 0 |
| 0.9895833333333334 | 0 |
| 0.9902777777777777 | 0 |
| 0.9909722222222223 | 0 |
| 0.9916666666666667 | 0 |
| 0.9923611111111111 | 0 |
| 0.9930555555555555 | 0 |
| 0.99375 | 0 |
| 0.9944444444444445 | 0 |
| 0.9951388888888889 | 0 |
| 0.9958333333333332 | 0 |
| 0.9965277777777778 | 0 |
| 0.9972222222222222 | 0 |
| 0.9979166666666667 | 0 |
| 0.998611111111111 | 0 |
| 0.9993055555555556 | 0 |